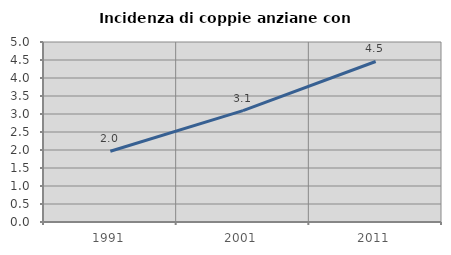
| Category | Incidenza di coppie anziane con figli |
|---|---|
| 1991.0 | 1.966 |
| 2001.0 | 3.094 |
| 2011.0 | 4.459 |